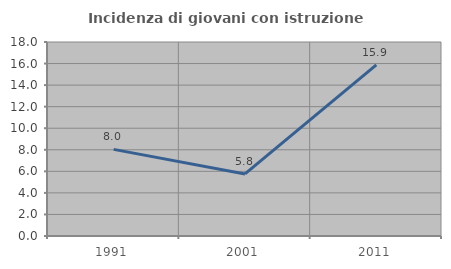
| Category | Incidenza di giovani con istruzione universitaria |
|---|---|
| 1991.0 | 8.036 |
| 2001.0 | 5.759 |
| 2011.0 | 15.882 |